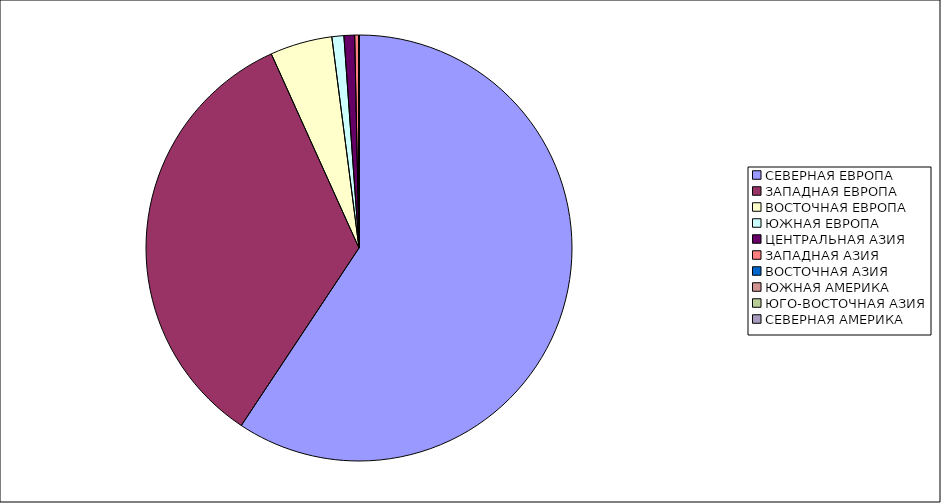
| Category | Оборот |
|---|---|
| СЕВЕРНАЯ ЕВРОПА | 59.319 |
| ЗАПАДНАЯ ЕВРОПА | 33.927 |
| ВОСТОЧНАЯ ЕВРОПА | 4.714 |
| ЮЖНАЯ ЕВРОПА | 0.908 |
| ЦЕНТРАЛЬНАЯ АЗИЯ | 0.81 |
| ЗАПАДНАЯ АЗИЯ | 0.294 |
| ВОСТОЧНАЯ АЗИЯ | 0.027 |
| ЮЖНАЯ АМЕРИКА | 0.001 |
| ЮГО-ВОСТОЧНАЯ АЗИЯ | 0.001 |
| СЕВЕРНАЯ АМЕРИКА | 0 |